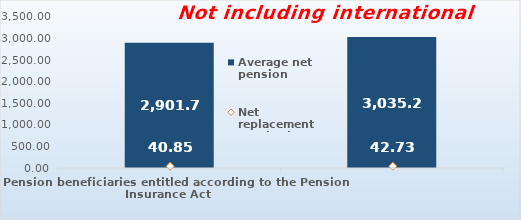
| Category | Average net pension  |
|---|---|
| Pension beneficiaries entitled according to the Pension Insurance Act   | 2901.74 |
| Pension beneficiaries entitled to pension FOR THE FIRST TIME in 2021 according to the Pension Insurance Act  - NEW BENEFICIARIES | 3035.204 |